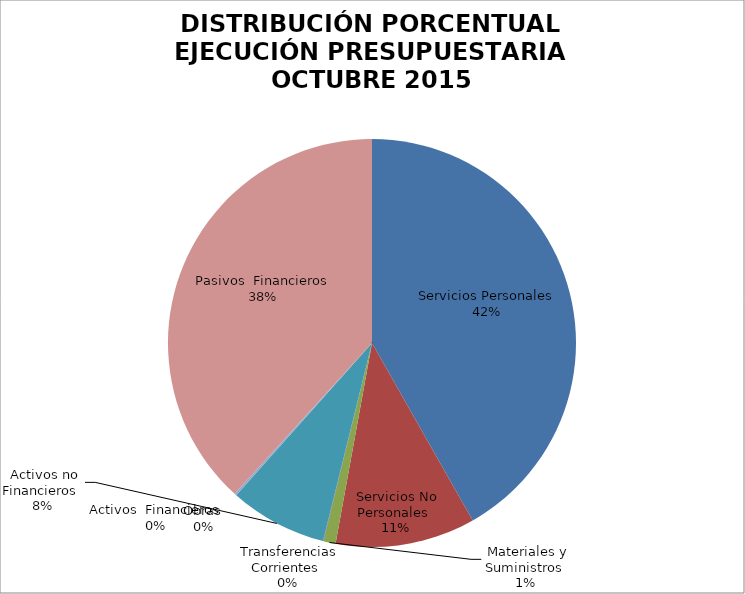
| Category | Series 0 | Series 1 |
|---|---|---|
| Servicios Personales | 11011894.74 | 0.418 |
| Servicios No Personales | 2919844.13 | 0.111 |
| Materiales y Suministros | 254219.41 | 0.01 |
| Transferencias Corrientes | 8800 | 0 |
| Activos no Financieros | 2036618.44 | 0.077 |
| Obras | 0 | 0 |
| Activos  Financieros | 45055 | 0.002 |
| Pasivos  Financieros | 10078577.75 | 0.382 |